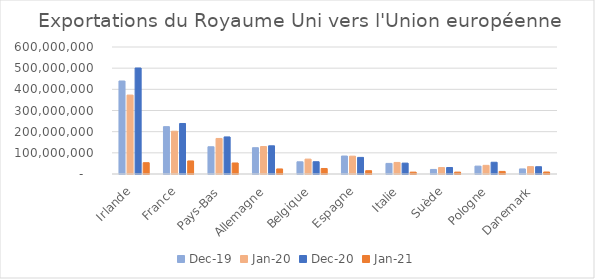
| Category | déc-19 | janv-20 | déc-20 | janv-21 |
|---|---|---|---|---|
| Irlande | 439389514 | 372862199 | 500833185 | 53404983 |
| France | 223695980 | 202093134 | 238623802 | 61654231 |
| Pays-Bas | 128729974 | 167877885 | 175102803 | 52046283 |
| Allemagne | 124259228 | 129789058 | 133216092 | 23850862 |
| Belgique | 57620646 | 70357756 | 57979489 | 26006859 |
| Espagne | 84951977 | 84285761 | 78414426 | 15616596 |
| Italie | 50035761 | 54595614 | 51438646 | 8814840 |
| Suède | 21541949 | 30342368 | 30691121 | 8888107 |
| Pologne | 37238525 | 40854836 | 55483331 | 12189400 |
| Danemark | 23951389 | 34792237 | 34391528 | 9435387 |